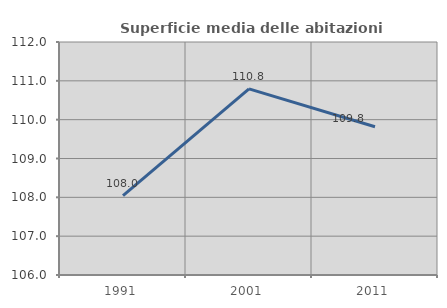
| Category | Superficie media delle abitazioni occupate |
|---|---|
| 1991.0 | 108.041 |
| 2001.0 | 110.791 |
| 2011.0 | 109.817 |